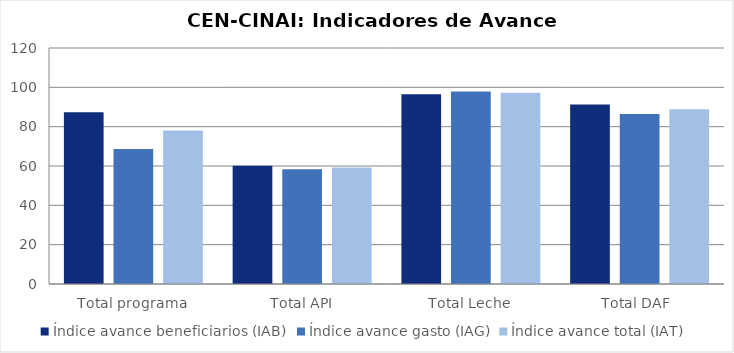
| Category | Índice avance beneficiarios (IAB)  | Índice avance gasto (IAG) | Índice avance total (IAT)  |
|---|---|---|---|
| Total programa | 87.328 | 68.66 | 77.994 |
| Total API | 60.113 | 58.41 | 59.262 |
| Total Leche | 96.539 | 97.924 | 97.231 |
| Total DAF  | 91.309 | 86.464 | 88.886 |